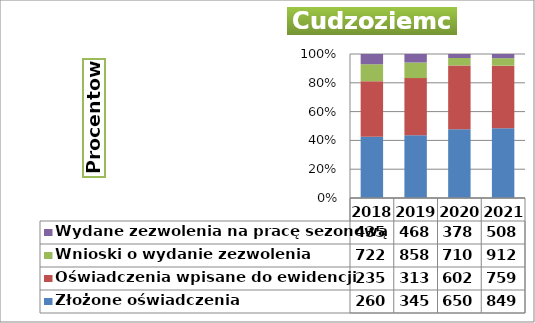
| Category | Złożone oświadczenia | Oświadczenia wpisane do ewidencji | Wnioski o wydanie zezwolenia | Wydane zezwolenia na pracę sezonową |
|---|---|---|---|---|
| 2018.0 | 2605 | 2355 | 722 | 435 |
| 2019.0 | 3455 | 3137 | 858 | 468 |
| 2020.0 | 6503 | 6027 | 710 | 378 |
| 2021.0 | 8493 | 7597 | 912 | 508 |